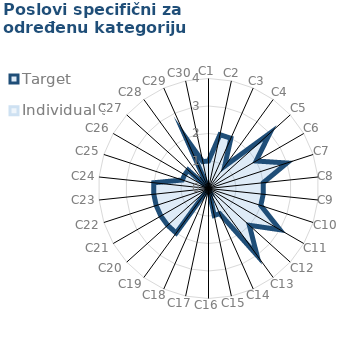
| Category | Target | Individual 3 |
|---|---|---|
| C1 | 1 | 0 |
| C2 | 2 | 0 |
| C3 | 2 | 0 |
| C4 | 1 | 0 |
| C5 | 3 | 0 |
| C6 | 2 | 0 |
| C7 | 3 | 0 |
| C8 | 2 | 0 |
| C9 | 2 | 0 |
| C10 | 2 | 0 |
| C11 | 3 | 0 |
| C12 | 2 | 0 |
| C13 | 3 | 0 |
| C14 | 1 | 0 |
| C15 | 1 | 0 |
| C16 | 0 | 0 |
| C17 | 0 | 0 |
| C18 | 0 | 0 |
| C19 | 2 | 0 |
| C20 | 2 | 0 |
| C21 | 2 | 0 |
| C22 | 2 | 0 |
| C23 | 2 | 0 |
| C24 | 2 | 0 |
| C25 | 1 | 0 |
| C26 | 1 | 0 |
| C27 | 1 | 0 |
| C28 | 0 | 0 |
| C29 | 2 | 0 |
| C30 | 1 | 0 |